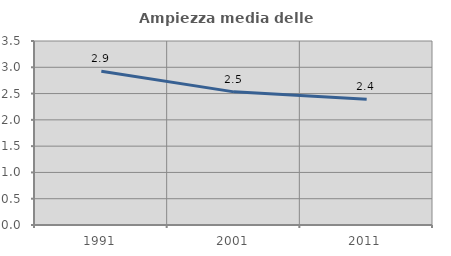
| Category | Ampiezza media delle famiglie |
|---|---|
| 1991.0 | 2.925 |
| 2001.0 | 2.532 |
| 2011.0 | 2.393 |